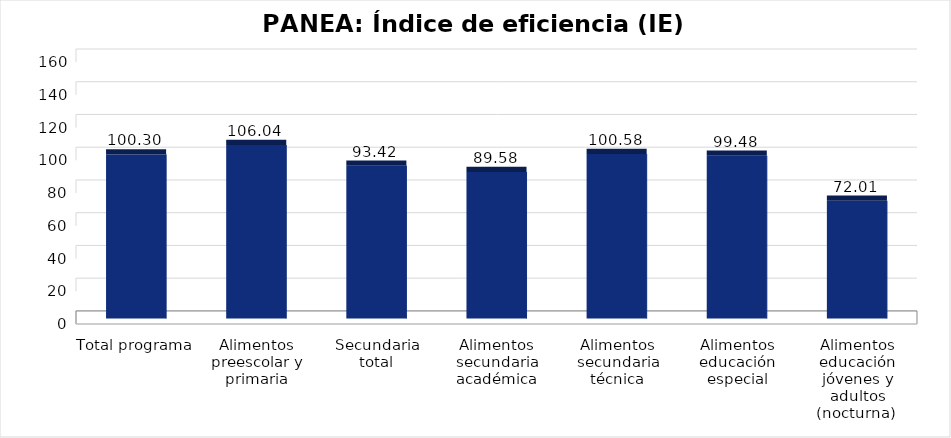
| Category | Índice de eficiencia (IE)  |
|---|---|
| Total programa | 100.301 |
| Alimentos preescolar y primaria | 106.038 |
| Secundaria total | 93.416 |
| Alimentos secundaria académica | 89.577 |
| Alimentos secundaria técnica | 100.583 |
| Alimentos educación especial | 99.481 |
| Alimentos educación jóvenes y adultos (nocturna)  | 72.011 |